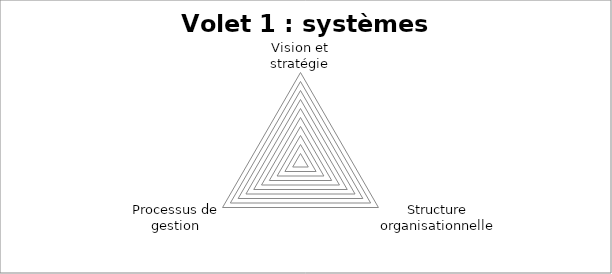
| Category | Series 0 |
|---|---|
| Vision et stratégie | 0 |
| Structure organisationnelle | 0 |
| Processus de gestion | 0 |